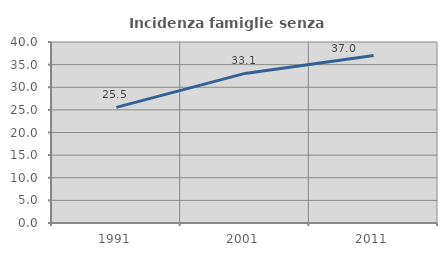
| Category | Incidenza famiglie senza nuclei |
|---|---|
| 1991.0 | 25.549 |
| 2001.0 | 33.063 |
| 2011.0 | 37.029 |